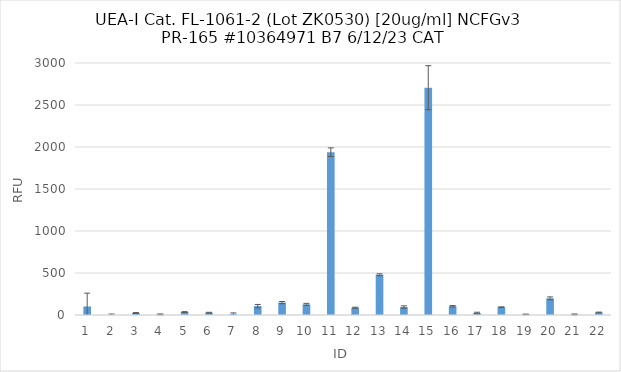
| Category | RFU |
|---|---|
| 0 | 101.75 |
| 1 | 1.25 |
| 2 | 23.25 |
| 3 | 7.25 |
| 4 | 35 |
| 5 | 26.75 |
| 6 | 12 |
| 7 | 105.25 |
| 8 | 147.75 |
| 9 | 126.5 |
| 10 | 1938.25 |
| 11 | 86.5 |
| 12 | 479.5 |
| 13 | 94.75 |
| 14 | 2705.75 |
| 15 | 103.75 |
| 16 | 23.75 |
| 17 | 93.5 |
| 18 | 7 |
| 19 | 198 |
| 20 | 6.5 |
| 21 | 30 |